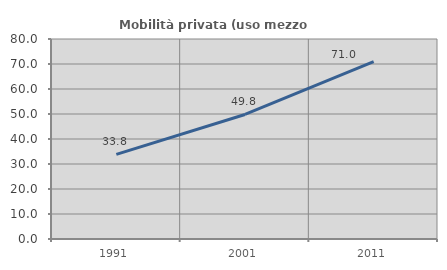
| Category | Mobilità privata (uso mezzo privato) |
|---|---|
| 1991.0 | 33.846 |
| 2001.0 | 49.817 |
| 2011.0 | 70.978 |